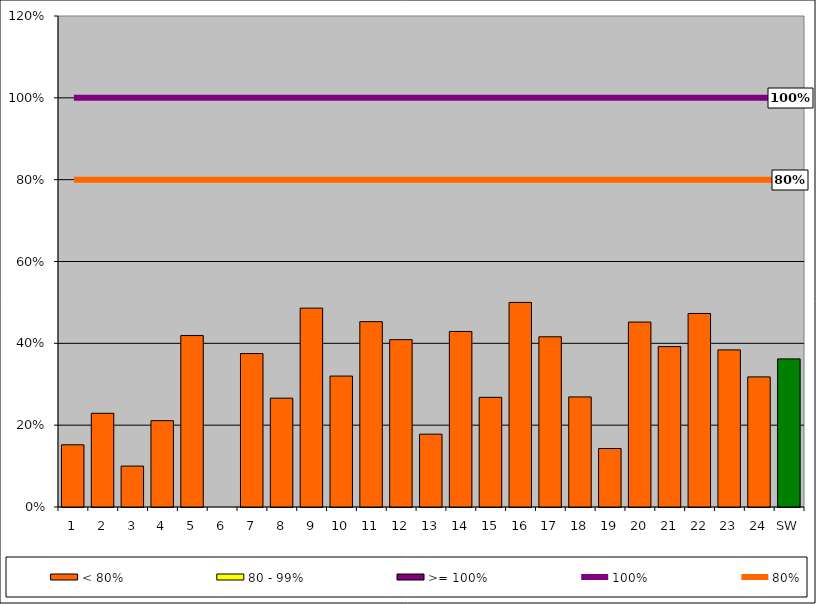
| Category | < 80% | 80 - 99% | >= 100% |
|---|---|---|---|
| 1 | 0.152 | 0 | 0 |
| 2 | 0.229 | 0 | 0 |
| 3 | 0.1 | 0 | 0 |
| 4 | 0.211 | 0 | 0 |
| 5 | 0.419 | 0 | 0 |
| 6 | 0 | 0 | 0 |
| 7 | 0.375 | 0 | 0 |
| 8 | 0.266 | 0 | 0 |
| 9 | 0.486 | 0 | 0 |
| 10 | 0.32 | 0 | 0 |
| 11 | 0.453 | 0 | 0 |
| 12 | 0.409 | 0 | 0 |
| 13 | 0.178 | 0 | 0 |
| 14 | 0.429 | 0 | 0 |
| 15 | 0.268 | 0 | 0 |
| 16 | 0.5 | 0 | 0 |
| 17 | 0.416 | 0 | 0 |
| 18 | 0.269 | 0 | 0 |
| 19 | 0.143 | 0 | 0 |
| 20 | 0.452 | 0 | 0 |
| 21 | 0.392 | 0 | 0 |
| 22 | 0.473 | 0 | 0 |
| 23 | 0.384 | 0 | 0 |
| 24 | 0.318 | 0 | 0 |
| SW | 0.362 | 0 | 0 |